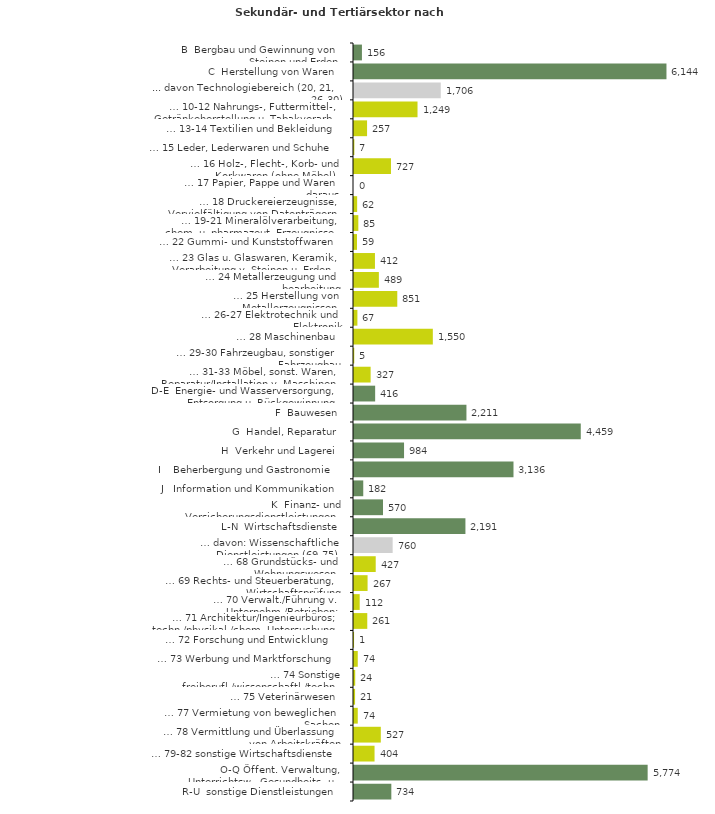
| Category | Series 0 |
|---|---|
| B  Bergbau und Gewinnung von Steinen und Erden | 156 |
| C  Herstellung von Waren | 6144 |
| ... davon Technologiebereich (20, 21, 26-30) | 1706 |
| … 10-12 Nahrungs-, Futtermittel-, Getränkeherstellung u. Tabakverarb. | 1249 |
| … 13-14 Textilien und Bekleidung | 257 |
| … 15 Leder, Lederwaren und Schuhe | 7 |
| … 16 Holz-, Flecht-, Korb- und Korkwaren (ohne Möbel)  | 727 |
| … 17 Papier, Pappe und Waren daraus  | 0 |
| … 18 Druckereierzeugnisse, Vervielfältigung von Datenträgern | 62 |
| … 19-21 Mineralölverarbeitung, chem. u. pharmazeut. Erzeugnisse | 85 |
| … 22 Gummi- und Kunststoffwaren | 59 |
| … 23 Glas u. Glaswaren, Keramik, Verarbeitung v. Steinen u. Erden  | 412 |
| … 24 Metallerzeugung und -bearbeitung | 489 |
| … 25 Herstellung von Metallerzeugnissen  | 851 |
| … 26-27 Elektrotechnik und Elektronik | 67 |
| … 28 Maschinenbau | 1550 |
| … 29-30 Fahrzeugbau, sonstiger Fahrzeugbau | 5 |
| … 31-33 Möbel, sonst. Waren, Reparatur/Installation v. Maschinen | 327 |
| D-E  Energie- und Wasserversorgung, Entsorgung u. Rückgewinnung | 416 |
| F  Bauwesen | 2211 |
| G  Handel, Reparatur | 4459 |
| H  Verkehr und Lagerei | 984 |
| I    Beherbergung und Gastronomie | 3136 |
| J   Information und Kommunikation | 182 |
| K  Finanz- und Versicherungsdienstleistungen | 570 |
| L-N  Wirtschaftsdienste | 2191 |
| … davon: Wissenschaftliche Dienstleistungen (69-75) | 760 |
| … 68 Grundstücks- und Wohnungswesen  | 427 |
| … 69 Rechts- und Steuerberatung, Wirtschaftsprüfung | 267 |
| … 70 Verwalt./Führung v. Unternehm./Betrieben; Unternehmensberat. | 112 |
| … 71 Architektur/Ingenieurbüros; techn./physikal./chem. Untersuchung | 261 |
| … 72 Forschung und Entwicklung  | 1 |
| … 73 Werbung und Marktforschung | 74 |
| … 74 Sonstige freiberufl./wissenschaftl./techn. Tätigkeiten | 24 |
| … 75 Veterinärwesen | 21 |
| … 77 Vermietung von beweglichen Sachen  | 74 |
| … 78 Vermittlung und Überlassung von Arbeitskräften | 527 |
| … 79-82 sonstige Wirtschaftsdienste | 404 |
| O-Q Öffent. Verwaltung, Unterrichtsw., Gesundheits- u. Sozialwesen | 5774 |
| R-U  sonstige Dienstleistungen | 734 |